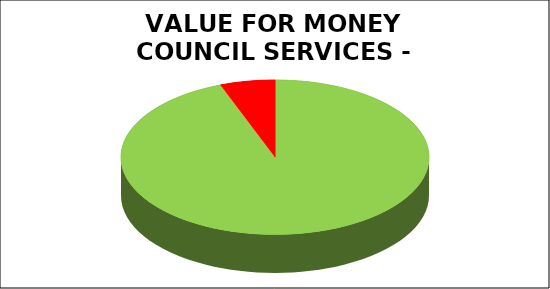
| Category | Series 0 |
|---|---|
| Green | 0.942 |
| Amber | 0 |
| Red | 0.058 |